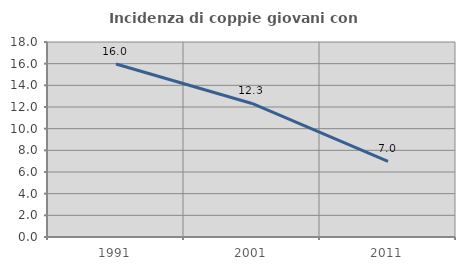
| Category | Incidenza di coppie giovani con figli |
|---|---|
| 1991.0 | 15.973 |
| 2001.0 | 12.324 |
| 2011.0 | 6.989 |